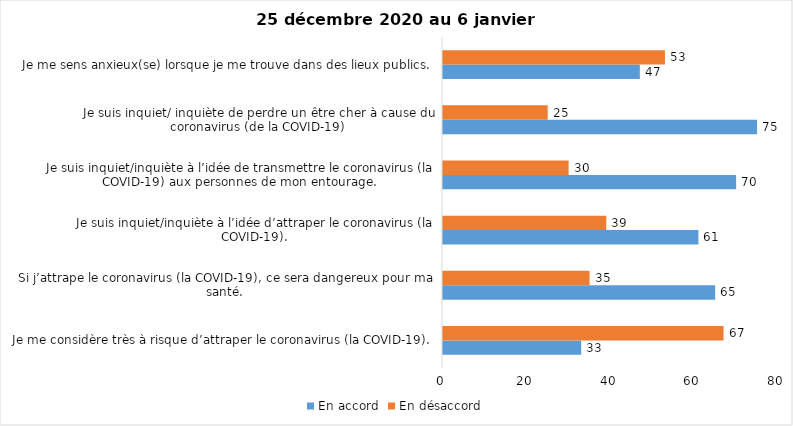
| Category | En accord | En désaccord |
|---|---|---|
| Je me considère très à risque d’attraper le coronavirus (la COVID-19). | 33 | 67 |
| Si j’attrape le coronavirus (la COVID-19), ce sera dangereux pour ma santé. | 65 | 35 |
| Je suis inquiet/inquiète à l’idée d’attraper le coronavirus (la COVID-19). | 61 | 39 |
| Je suis inquiet/inquiète à l’idée de transmettre le coronavirus (la COVID-19) aux personnes de mon entourage. | 70 | 30 |
| Je suis inquiet/ inquiète de perdre un être cher à cause du coronavirus (de la COVID-19) | 75 | 25 |
| Je me sens anxieux(se) lorsque je me trouve dans des lieux publics. | 47 | 53 |